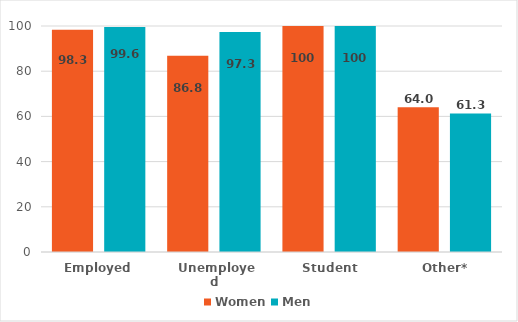
| Category | Women | Men |
|---|---|---|
| Employed | 98.3 | 99.6 |
|  Unemployed | 86.8 | 97.3 |
|  Student | 100 | 100 |
|  Other* | 64 | 61.3 |